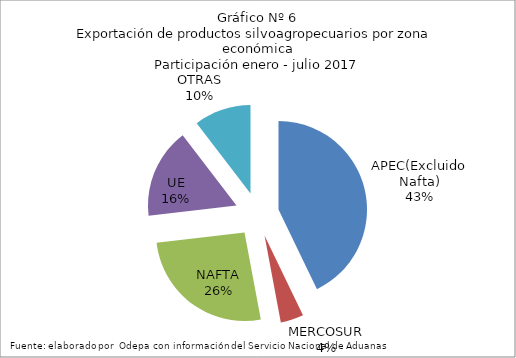
| Category | Series 0 |
|---|---|
| APEC(Excluido Nafta) | 4125697.489 |
| MERCOSUR | 404527.13 |
| NAFTA | 2514122.688 |
| UE | 1583310.213 |
| OTRAS | 1002198.48 |